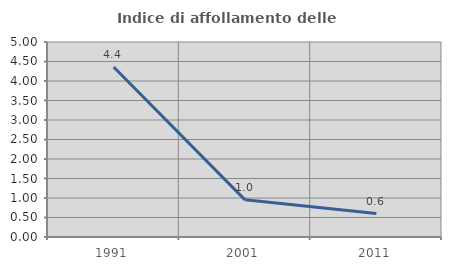
| Category | Indice di affollamento delle abitazioni  |
|---|---|
| 1991.0 | 4.359 |
| 2001.0 | 0.953 |
| 2011.0 | 0.601 |